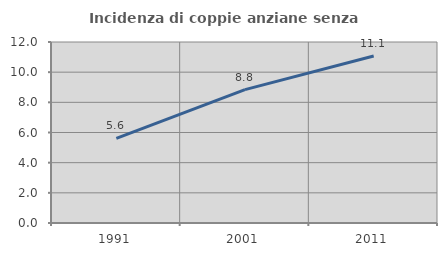
| Category | Incidenza di coppie anziane senza figli  |
|---|---|
| 1991.0 | 5.612 |
| 2001.0 | 8.845 |
| 2011.0 | 11.075 |